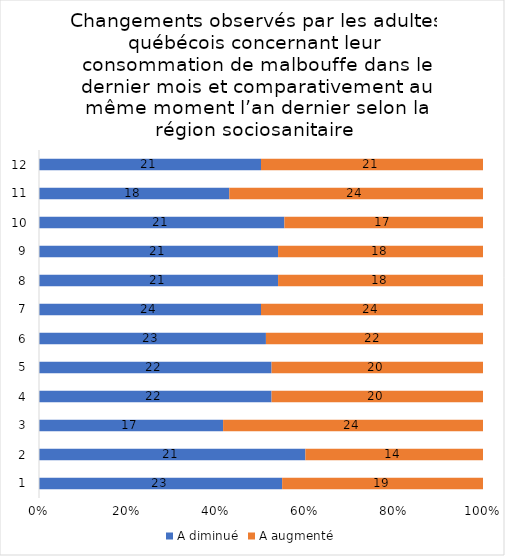
| Category | A diminué | A augmenté |
|---|---|---|
| 0 | 23 | 19 |
| 1 | 21 | 14 |
| 2 | 17 | 24 |
| 3 | 22 | 20 |
| 4 | 22 | 20 |
| 5 | 23 | 22 |
| 6 | 24 | 24 |
| 7 | 21 | 18 |
| 8 | 21 | 18 |
| 9 | 21 | 17 |
| 10 | 18 | 24 |
| 11 | 21 | 21 |